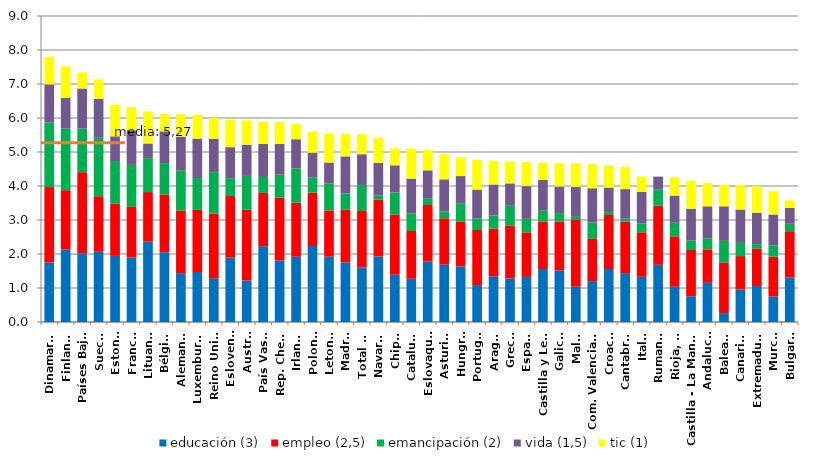
| Category | educación (3) | empleo (2,5) | emancipación (2) | vida (1,5) | tic (1) |
|---|---|---|---|---|---|
| Dinamarca | 1.752 | 2.217 | 1.895 | 1.125 | 0.812 |
| Finlandia | 2.136 | 1.741 | 1.809 | 0.909 | 0.92 |
| Países Bajos | 2.02 | 2.387 | 1.28 | 1.181 | 0.475 |
| Suecia | 2.067 | 1.633 | 1.716 | 1.151 | 0.569 |
| Estonia | 1.944 | 1.54 | 1.251 | 0.727 | 0.933 |
| Francia | 1.898 | 1.489 | 1.235 | 1.018 | 0.676 |
| Lituania | 2.364 | 1.458 | 1 | 0.429 | 0.941 |
| Bélgica | 2.052 | 1.697 | 0.923 | 0.935 | 0.515 |
| Alemania | 1.436 | 1.844 | 1.18 | 0.991 | 0.664 |
| Luxemburgo | 1.47 | 1.828 | 0.937 | 1.158 | 0.705 |
| Reino Unido | 1.288 | 1.898 | 1.221 | 0.977 | 0.621 |
| Eslovenia | 1.893 | 1.814 | 0.521 | 0.914 | 0.811 |
| Austria | 1.224 | 2.075 | 0.997 | 0.919 | 0.717 |
| País Vasco | 2.229 | 1.568 | 0.469 | 0.972 | 0.653 |
| Rep. Checa | 1.809 | 1.85 | 0.674 | 0.91 | 0.633 |
| Irlanda | 1.918 | 1.59 | 1.002 | 0.866 | 0.458 |
| Polonia | 2.235 | 1.567 | 0.448 | 0.73 | 0.621 |
| Letonia | 1.922 | 1.36 | 0.794 | 0.616 | 0.85 |
| Madrid | 1.752 | 1.553 | 0.474 | 1.091 | 0.669 |
| Total UE | 1.607 | 1.659 | 0.765 | 0.903 | 0.593 |
| Navarra | 1.93 | 1.671 | 0.121 | 0.958 | 0.743 |
| Chipre | 1.39 | 1.77 | 0.647 | 0.802 | 0.499 |
| Cataluña | 1.27 | 1.406 | 0.518 | 1.022 | 0.889 |
| Eslovaquia | 1.783 | 1.659 | 0.181 | 0.839 | 0.597 |
| Asturias | 1.686 | 1.364 | 0.202 | 0.944 | 0.741 |
| Hungría | 1.634 | 1.317 | 0.54 | 0.801 | 0.549 |
| Portugal | 1.086 | 1.621 | 0.339 | 0.85 | 0.877 |
| Aragón | 1.341 | 1.405 | 0.389 | 0.909 | 0.694 |
| Grecia | 1.28 | 1.562 | 0.576 | 0.659 | 0.645 |
| España | 1.325 | 1.312 | 0.396 | 0.963 | 0.701 |
| Castilla y León | 1.56 | 1.39 | 0.322 | 0.905 | 0.508 |
| Galicia | 1.519 | 1.436 | 0.248 | 0.782 | 0.686 |
| Malta | 1.037 | 1.981 | 0.098 | 0.859 | 0.688 |
| Com. Valenciana | 1.204 | 1.241 | 0.481 | 1.007 | 0.712 |
| Croacia | 1.559 | 1.588 | 0.086 | 0.722 | 0.65 |
| Cantabria | 1.436 | 1.519 | 0.082 | 0.872 | 0.649 |
| Italia | 1.328 | 1.311 | 0.265 | 0.927 | 0.447 |
| Rumania | 1.682 | 1.74 | 0.48 | 0.373 | 0 |
| Rioja, La | 1.037 | 1.484 | 0.397 | 0.801 | 0.536 |
| Castilla - La Mancha | 0.757 | 1.362 | 0.281 | 0.933 | 0.817 |
| Andalucía | 1.151 | 0.987 | 0.321 | 0.943 | 0.683 |
| Balears | 0.261 | 1.485 | 0.64 | 1.016 | 0.63 |
| Canarias | 0.956 | 0.983 | 0.387 | 0.983 | 0.722 |
| Extremadura | 1.06 | 1.093 | 0.138 | 0.923 | 0.778 |
| Murcia | 0.754 | 1.166 | 0.33 | 0.914 | 0.687 |
| Bulgaria | 1.313 | 1.358 | 0.217 | 0.464 | 0.229 |